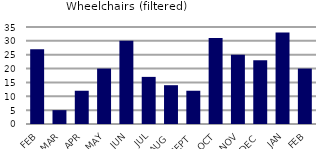
| Category | Wheelchairs (filtered) |
|---|---|
| FEB | 27 |
| MAR | 5 |
| APR | 12 |
| MAY | 20 |
| JUN | 30 |
| JUL | 17 |
| AUG | 14 |
| SEPT | 12 |
| OCT | 31 |
| NOV | 25 |
| DEC | 23 |
| JAN | 33 |
| FEB | 20 |